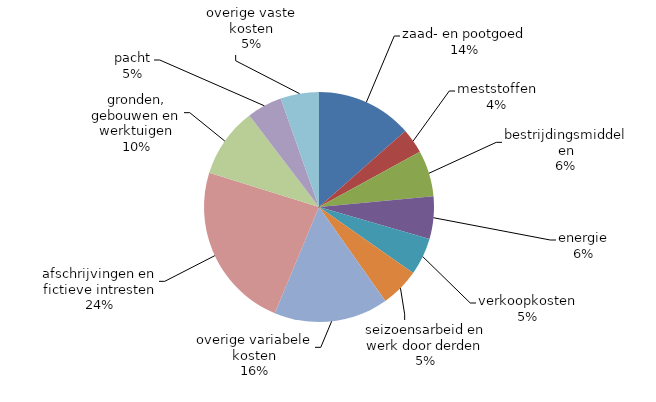
| Category | Series 0 |
|---|---|
| zaad- en pootgoed | 16491.5 |
| meststoffen | 4291.15 |
| bestrijdingsmiddelen | 7901.254 |
| energie | 7293.909 |
| verkoopkosten | 6414.226 |
| seizoensarbeid en werk door derden | 6681.677 |
| overige variabele kosten | 19632.401 |
| afschrijvingen en fictieve intresten | 28703.742 |
| gronden, gebouwen en werktuigen | 12011.552 |
| pacht | 6038.397 |
| overige vaste kosten | 6599.979 |